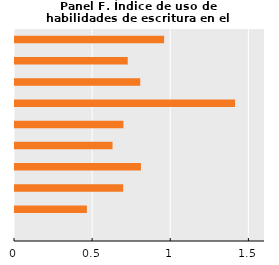
| Category | Índice de uso de habilidades de escritura en el trabajo  |
|---|---|
| Fuerzas armadas | 0 |
| Legisladores | 0.46 |
| Directivos | 0.692 |
| Técnicos | 0.806 |
| Apoyo administrativo | 0.624 |
| Servicios | 0.694 |
| Agricultura calificada | 1.408 |
| Operarios | 0.802 |
| Artes y oficios | 0.721 |
| Ocupaciones no calificadas | 0.955 |